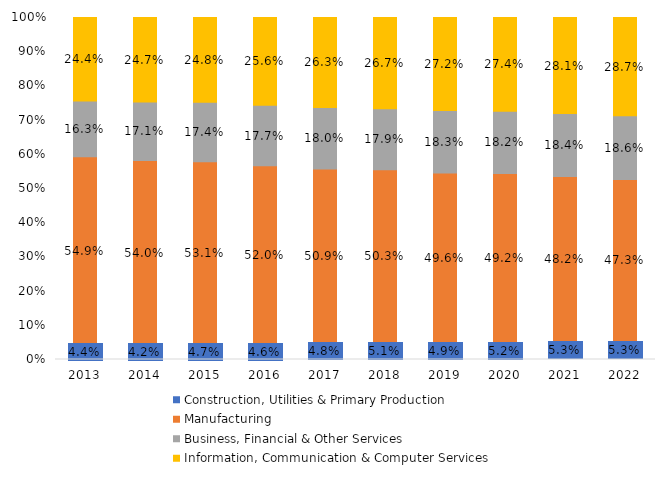
| Category | Construction, Utilities & Primary Production  | Manufacturing  | Business, Financial & Other Services | Information, Communication & Computer Services |
|---|---|---|---|---|
| 2013.0 | 0.044 | 0.549 | 0.163 | 0.244 |
| 2014.0 | 0.042 | 0.54 | 0.171 | 0.247 |
| 2015.0 | 0.047 | 0.531 | 0.174 | 0.248 |
| 2016.0 | 0.046 | 0.52 | 0.177 | 0.256 |
| 2017.0 | 0.048 | 0.509 | 0.18 | 0.263 |
| 2018.0 | 0.051 | 0.503 | 0.179 | 0.267 |
| 2019.0 | 0.049 | 0.496 | 0.183 | 0.272 |
| 2020.0 | 0.052 | 0.492 | 0.182 | 0.274 |
| 2021.0 | 0.053 | 0.482 | 0.184 | 0.281 |
| 2022.0 | 0.053 | 0.473 | 0.186 | 0.287 |